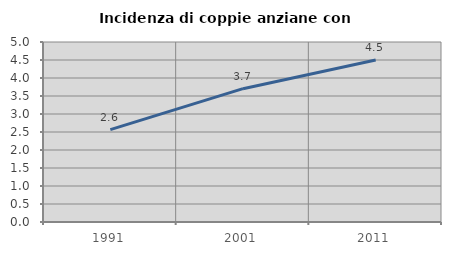
| Category | Incidenza di coppie anziane con figli |
|---|---|
| 1991.0 | 2.566 |
| 2001.0 | 3.704 |
| 2011.0 | 4.498 |